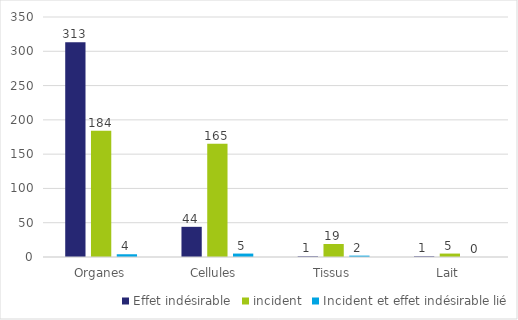
| Category | Effet indésirable | incident | Incident et effet indésirable lié |
|---|---|---|---|
| Organes | 313 | 184 | 4 |
| Cellules  | 44 | 165 | 5 |
| Tissus | 1 | 19 | 2 |
| Lait | 1 | 5 | 0 |